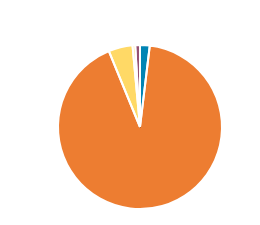
| Category | Series 0 |
|---|---|
| PC/MC | 2359 |
| CAR/LGV | 113803 |
| OGV1 & PSV 2Axle | 5878 |
| OGV1 & PSV 3 Axle | 643 |
| OGV2 | 1162 |